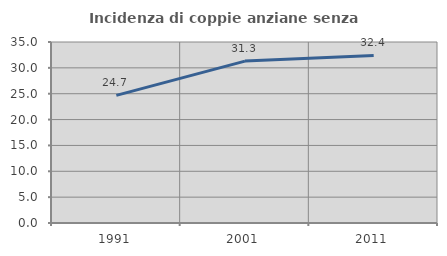
| Category | Incidenza di coppie anziane senza figli  |
|---|---|
| 1991.0 | 24.675 |
| 2001.0 | 31.304 |
| 2011.0 | 32.394 |